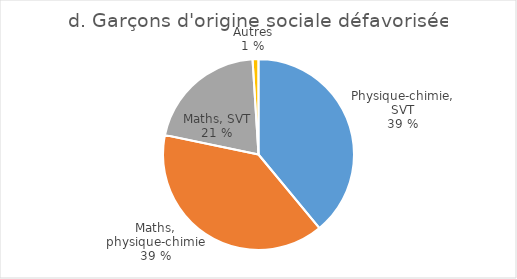
| Category | Garçons d'origine sociale défavorisée |
|---|---|
| Physique-chimie, SVT | 3045 |
| Mathématiques, physique-chimie | 3067 |
| Mathématiques, SVT | 1620 |
| Autres | 78 |